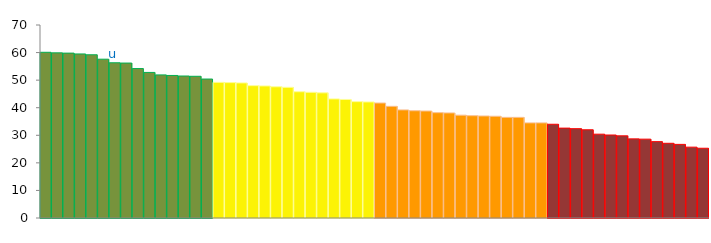
| Category | Top Quartile | 2nd Quartile | 3rd Quartile | Bottom Quartile | Series 4 |
|---|---|---|---|---|---|
|  | 60.1 | 0 | 0 | 0 | 60.1 |
|  | 59.9 | 0 | 0 | 0 | 59.9 |
|  | 59.8 | 0 | 0 | 0 | 59.8 |
|  | 59.5 | 0 | 0 | 0 | 59.5 |
|  | 59.2 | 0 | 0 | 0 | 59.2 |
|  | 57.6 | 0 | 0 | 0 | 57.6 |
| u | 56.3 | 0 | 0 | 0 | 56.3 |